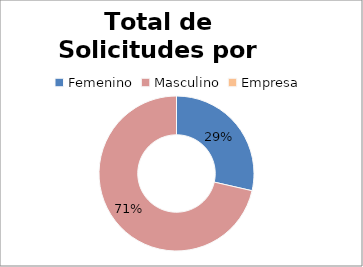
| Category | Series 0 |
|---|---|
| 0 | 4 |
| 1 | 10 |
| 2 | 0 |